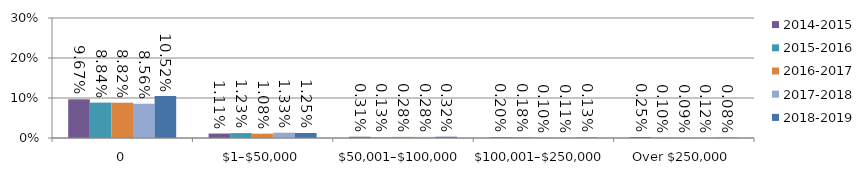
| Category | 2014-2015 | 2015-2016 | 2016-2017 | 2017-2018 | 2018-2019 |
|---|---|---|---|---|---|
| 0 | 0.097 | 0.088 | 0.088 | 0.086 | 0.105 |
| $1–$50,000 | 0.011 | 0.012 | 0.011 | 0.013 | 0.013 |
| $50,001–$100,000 | 0.003 | 0.001 | 0.003 | 0.003 | 0.003 |
| $100,001–$250,000 | 0.002 | 0.002 | 0.001 | 0.001 | 0.001 |
| Over $250,000 | 0.003 | 0.001 | 0.001 | 0.001 | 0.001 |